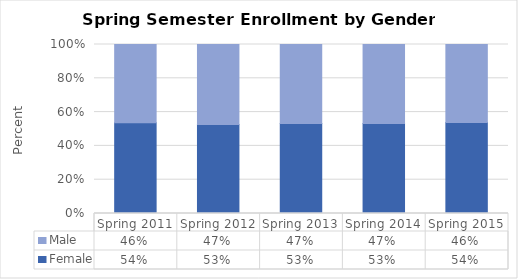
| Category | Female | Male |
|---|---|---|
| Spring 2011 | 0.537 | 0.463 |
| Spring 2012 | 0.527 | 0.473 |
| Spring 2013 | 0.533 | 0.467 |
| Spring 2014 | 0.533 | 0.467 |
| Spring 2015 | 0.538 | 0.462 |